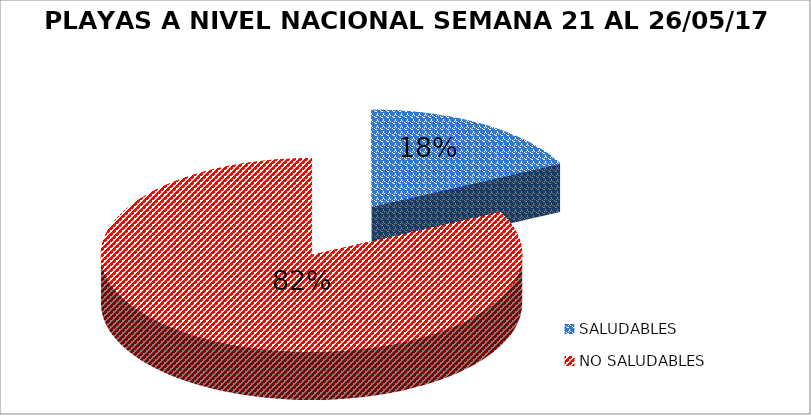
| Category | N.° |
|---|---|
| SALUDABLES | 21 |
| NO SALUDABLES | 98 |